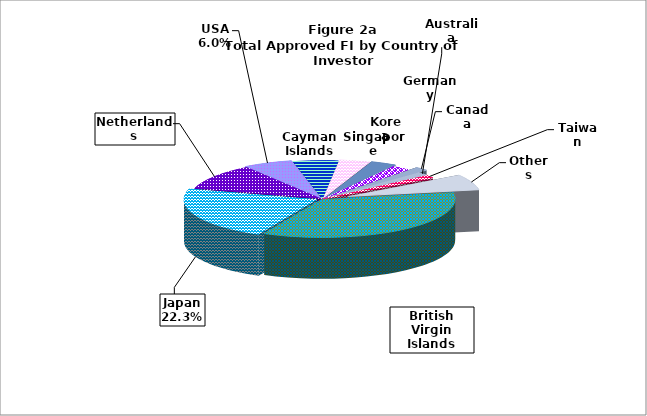
| Category | Series 0 |
|---|---|
| British Virgin Islands | 46141.706 |
| Japan | 29377.066 |
| Netherlands | 14444.95 |
| USA | 7964.363 |
| Cayman Islands | 7264.413 |
| Singapore | 4939.111 |
| Korea | 4209.209 |
| Germany | 2999.723 |
| Canada | 2207.956 |
| Australia | 2001.743 |
| Taiwan | 1688.413 |
| Others | 8720.616 |